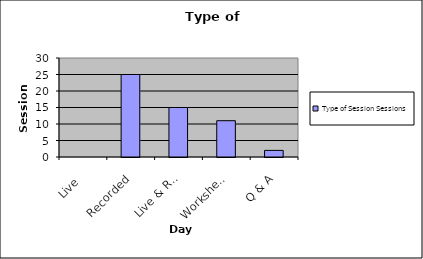
| Category | Type of Session |
|---|---|
| Live | 0 |
| Recorded | 25 |
| Live & Record. | 15 |
| Worksheet | 11 |
| Q & A | 2 |